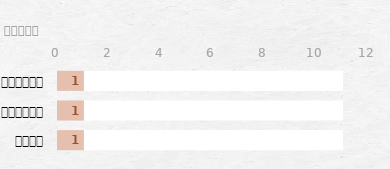
| Category | Series 1 | Series 0 |
|---|---|---|
| अन्य | 11 | 1 |
| दुल्हा | 11 | 1 |
| दुल्हन | 11 | 1 |